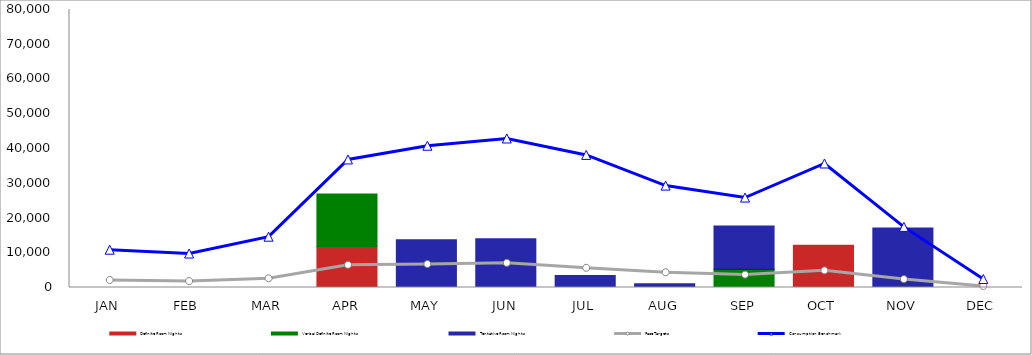
| Category | Definite Room Nights | Verbal Definite Room Nights | Tentative Room Nights |
|---|---|---|---|
| JAN | 0 | 0 | 0 |
| FEB | 0 | 0 | 0 |
| MAR | 0 | 0 | 0 |
| APR | 11770 | 15137 | 0 |
| MAY | 0 | 0 | 13775 |
| JUN | 0 | 0 | 14000 |
| JUL | 0 | 0 | 3440 |
| AUG | 0 | 0 | 1080 |
| SEP | 0 | 5250 | 12424 |
| OCT | 12155 | 0 | 0 |
| NOV | 0 | 0 | 17153 |
| DEC | 0 | 0 | 0 |